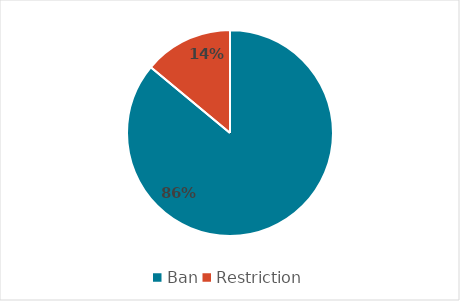
| Category | Series 0 |
|---|---|
| Ban | 0.86 |
| Restriction | 0.14 |